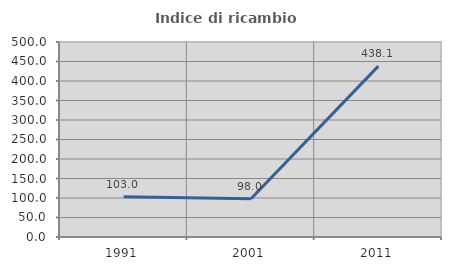
| Category | Indice di ricambio occupazionale  |
|---|---|
| 1991.0 | 103.03 |
| 2001.0 | 97.959 |
| 2011.0 | 438.095 |